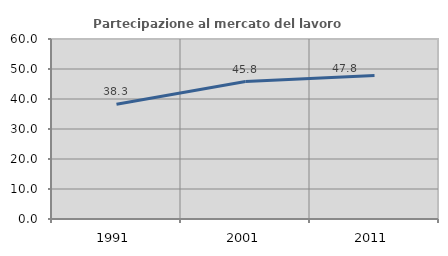
| Category | Partecipazione al mercato del lavoro  femminile |
|---|---|
| 1991.0 | 38.262 |
| 2001.0 | 45.833 |
| 2011.0 | 47.845 |